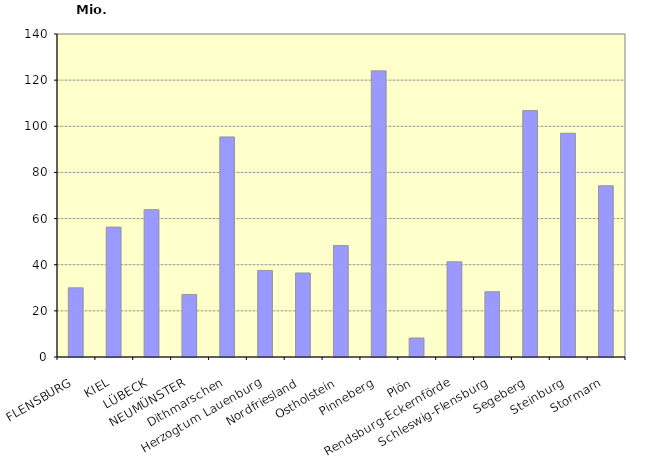
| Category | Series 0 |
|---|---|
| FLENSBURG | 29.975 |
| KIEL | 56.299 |
| LÜBECK | 63.865 |
| NEUMÜNSTER | 27.109 |
| Dithmarschen | 95.374 |
| Herzogtum Lauenburg | 37.523 |
| Nordfriesland | 36.412 |
| Ostholstein | 48.283 |
| Pinneberg | 124.037 |
| Plön | 8.24 |
| Rendsburg-Eckernförde | 41.264 |
| Schleswig-Flensburg | 28.288 |
| Segeberg | 106.802 |
| Steinburg | 96.969 |
| Stormarn | 74.208 |